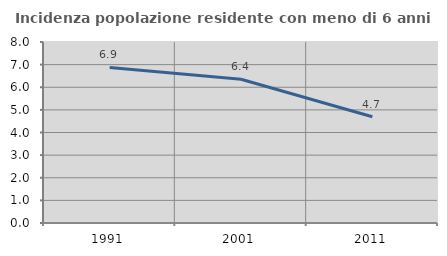
| Category | Incidenza popolazione residente con meno di 6 anni |
|---|---|
| 1991.0 | 6.876 |
| 2001.0 | 6.357 |
| 2011.0 | 4.698 |